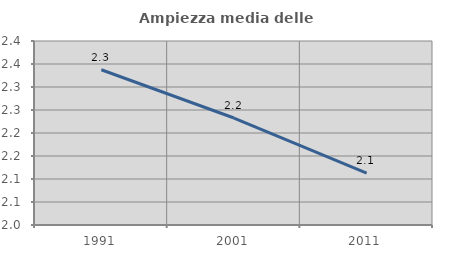
| Category | Ampiezza media delle famiglie |
|---|---|
| 1991.0 | 2.338 |
| 2001.0 | 2.233 |
| 2011.0 | 2.113 |